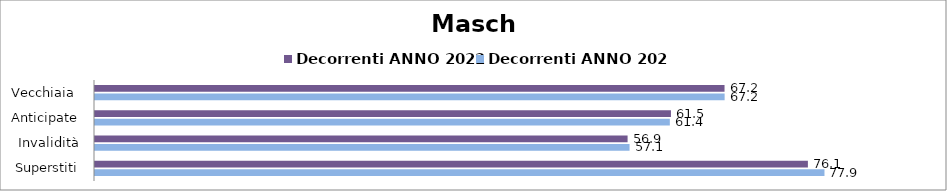
| Category | Decorrenti ANNO 2022 | Decorrenti ANNO 2023 |
|---|---|---|
| Vecchiaia  | 67.21 | 67.22 |
| Anticipate | 61.49 | 61.37 |
| Invalidità | 56.86 | 57.07 |
| Superstiti | 76.11 | 77.88 |